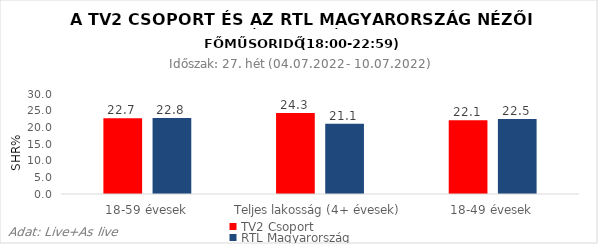
| Category | TV2 Csoport | RTL Magyarország |
|---|---|---|
| 18-59 évesek | 22.7 | 22.8 |
| Teljes lakosság (4+ évesek) | 24.3 | 21.1 |
| 18-49 évesek | 22.1 | 22.5 |